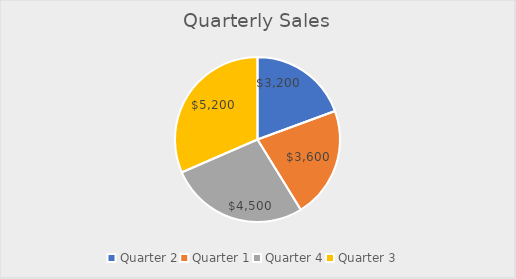
| Category | Sales |
|---|---|
| Quarter 2 | 3200 |
| Quarter 1 | 3600 |
| Quarter 4 | 4500 |
| Quarter 3 | 5200 |